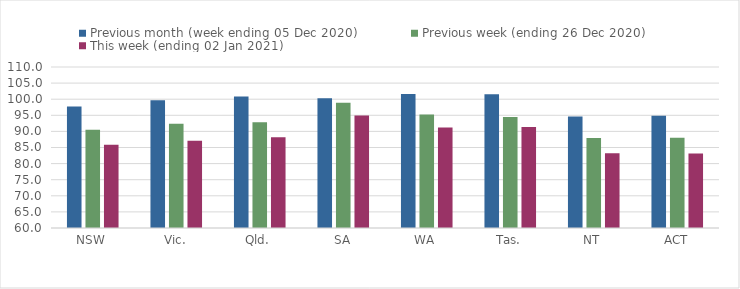
| Category | Previous month (week ending 05 Dec 2020) | Previous week (ending 26 Dec 2020) | This week (ending 02 Jan 2021) |
|---|---|---|---|
| NSW | 97.71 | 90.55 | 85.82 |
| Vic. | 99.64 | 92.37 | 87.09 |
| Qld. | 100.81 | 92.85 | 88.16 |
| SA | 100.28 | 98.91 | 94.9 |
| WA | 101.65 | 95.22 | 91.25 |
| Tas. | 101.5 | 94.44 | 91.34 |
| NT | 94.65 | 87.95 | 83.24 |
| ACT | 94.88 | 88.05 | 83.14 |